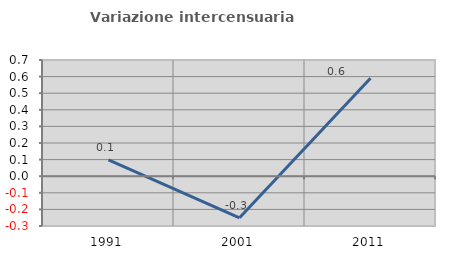
| Category | Variazione intercensuaria annua |
|---|---|
| 1991.0 | 0.098 |
| 2001.0 | -0.251 |
| 2011.0 | 0.59 |